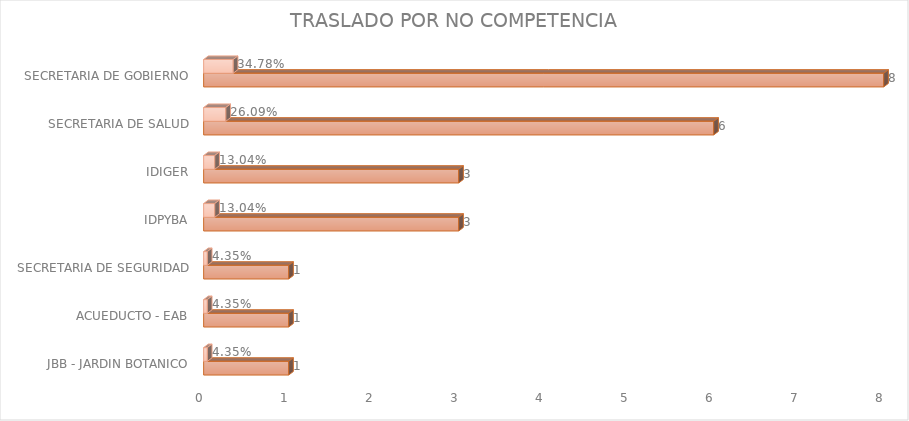
| Category | Cuenta de Número petición | Cuenta de Número petición2 |
|---|---|---|
| JBB - JARDIN BOTANICO | 1 | 0.043 |
| ACUEDUCTO - EAB | 1 | 0.043 |
| SECRETARIA DE SEGURIDAD | 1 | 0.043 |
| IDPYBA | 3 | 0.13 |
| IDIGER | 3 | 0.13 |
| SECRETARIA DE SALUD | 6 | 0.261 |
| SECRETARIA DE GOBIERNO | 8 | 0.348 |